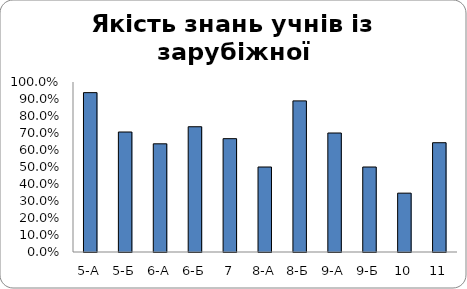
| Category | Series 0 |
|---|---|
| 5-А | 0.938 |
| 5-Б | 0.706 |
| 6-А | 0.636 |
| 6-Б | 0.737 |
| 7 | 0.667 |
| 8-А | 0.5 |
| 8-Б | 0.889 |
| 9-А | 0.7 |
| 9-Б | 0.5 |
| 10 | 0.346 |
| 11 | 0.643 |